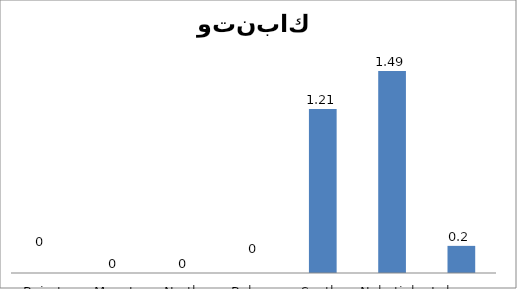
| Category | 02 |
|---|---|
| Beirut | 0 |
| Mount Lebanon | 0 |
| North | 0 |
| Bekaa | 0 |
| South | 1.21 |
| Nabatieh | 1.49 |
| Lebanon | 0.2 |